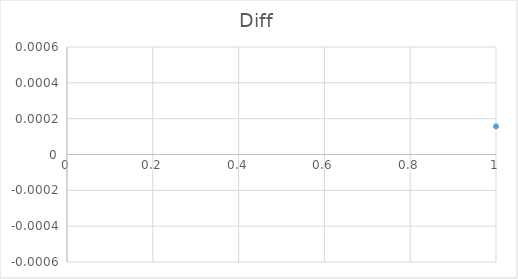
| Category | Diff |
|---|---|
| 0 | 0 |
| 1 | 0 |
| 2 | 0 |
| 3 | 0 |
| 4 | 0 |
| 5 | 0 |
| 6 | 0 |
| 7 | 0 |
| 8 | 0 |
| 9 | 0 |
| 10 | 0 |
| 11 | 0 |
| 12 | 0 |
| 13 | 0 |
| 14 | 0 |
| 15 | 0 |
| 16 | 0 |
| 17 | 0 |
| 18 | 0 |
| 19 | 0 |
| 20 | 0 |
| 21 | 0 |
| 22 | 0 |
| 23 | 0 |
| 24 | 0 |
| 25 | 0 |
| 26 | 0 |
| 27 | 0 |
| 28 | 0 |
| 29 | 0 |
| 30 | 0 |
| 31 | 0 |
| 32 | 0 |
| 33 | 0 |
| 34 | 0 |
| 35 | 0 |
| 36 | 0 |
| 37 | 0 |
| 38 | 0 |
| 39 | 0 |
| 40 | 0 |
| 41 | 0 |
| 42 | 0 |
| 43 | 0 |
| 44 | 0 |
| 45 | 0 |
| 46 | 0 |
| 47 | 0 |
| 48 | 0 |
| 49 | 0 |